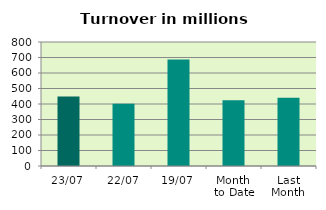
| Category | Series 0 |
|---|---|
| 23/07 | 447.977 |
| 22/07 | 400.834 |
| 19/07 | 686.712 |
| Month 
to Date | 423.929 |
| Last
Month | 439.695 |